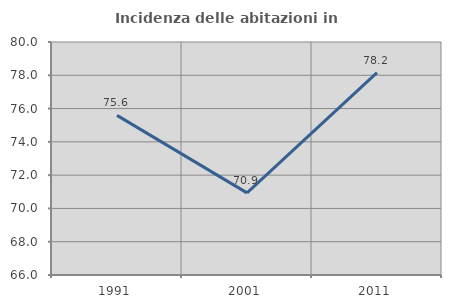
| Category | Incidenza delle abitazioni in proprietà  |
|---|---|
| 1991.0 | 75.591 |
| 2001.0 | 70.934 |
| 2011.0 | 78.154 |